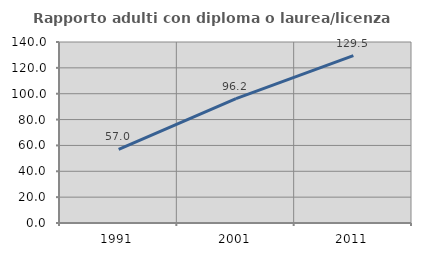
| Category | Rapporto adulti con diploma o laurea/licenza media  |
|---|---|
| 1991.0 | 56.957 |
| 2001.0 | 96.176 |
| 2011.0 | 129.459 |